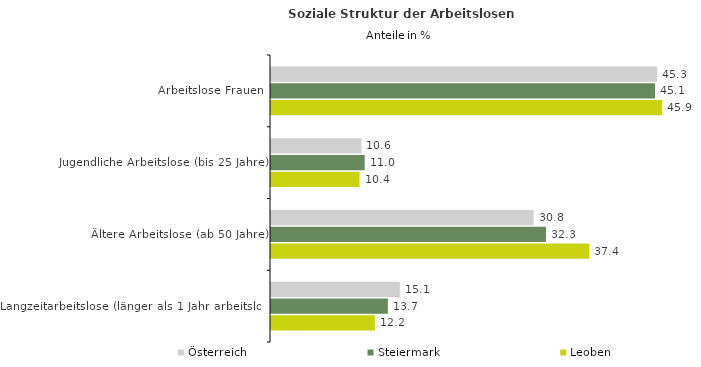
| Category | Österreich | Steiermark | Leoben |
|---|---|---|---|
| Arbeitslose Frauen | 45.325 | 45.075 | 45.914 |
| Jugendliche Arbeitslose (bis 25 Jahre) | 10.608 | 10.993 | 10.392 |
| Ältere Arbeitslose (ab 50 Jahre) | 30.822 | 32.281 | 37.364 |
| Langzeitarbeitslose (länger als 1 Jahr arbeitslos) | 15.122 | 13.717 | 12.187 |